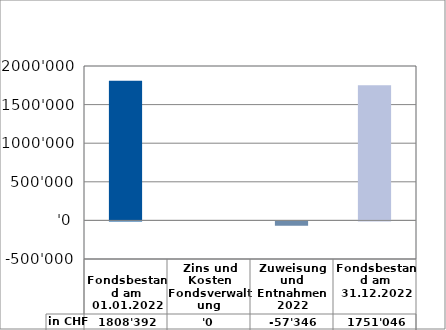
| Category | in CHF |
|---|---|
| 
Fondsbestand am 01.01.2022

 | 1808391.75 |
| Zins und Kosten Fondsverwaltung | 0 |
| Zuweisung und Entnahmen 2022 | -57345.85 |
| Fondsbestand am 31.12.2022 | 1751045.9 |